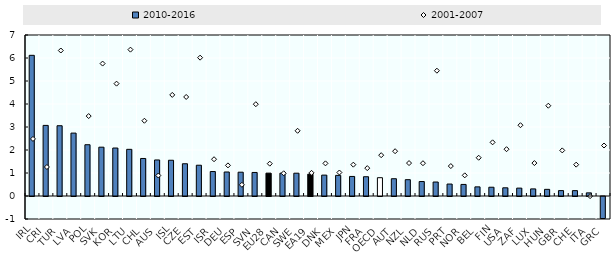
| Category | 2010-2016 |
|---|---|
| IRL | 6.117 |
| CRI | 3.07 |
| TUR | 3.055 |
| LVA | 2.735 |
| POL | 2.229 |
| SVK | 2.123 |
| KOR | 2.086 |
| LTU | 2.029 |
| CHL | 1.631 |
| AUS | 1.567 |
| ISL | 1.554 |
| CZE | 1.402 |
| EST | 1.338 |
| ISR | 1.064 |
| DEU | 1.044 |
| ESP | 1.035 |
| SVN | 1.023 |
| EU28 | 0.994 |
| CAN | 0.993 |
| SWE | 0.991 |
| EA19 | 0.95 |
| DNK | 0.908 |
| MEX | 0.897 |
| JPN | 0.85 |
| FRA | 0.838 |
| OECD | 0.796 |
| AUT | 0.751 |
| NZL | 0.71 |
| NLD | 0.629 |
| RUS | 0.608 |
| PRT | 0.52 |
| NOR | 0.503 |
| BEL | 0.397 |
| FIN | 0.381 |
| USA | 0.356 |
| ZAF | 0.343 |
| LUX | 0.309 |
| HUN | 0.289 |
| GBR | 0.235 |
| CHE | 0.233 |
| ITA | 0.136 |
| GRC | -1.091 |